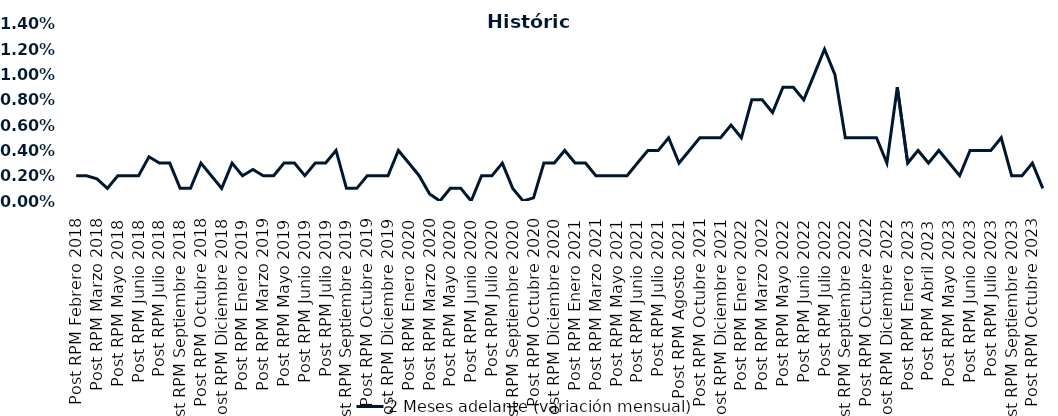
| Category | 2 Meses adelante (variación mensual) |
|---|---|
| Post RPM Febrero 2018 | 0.002 |
| Pre RPM Marzo 2018 | 0.002 |
| Post RPM Marzo 2018 | 0.002 |
| Pre RPM Mayo 2018 | 0.001 |
| Post RPM Mayo 2018 | 0.002 |
| Pre RPM Junio 2018 | 0.002 |
| Post RPM Junio 2018 | 0.002 |
| Pre RPM Julio 2018 | 0.004 |
| Post RPM Julio 2018 | 0.003 |
| Pre RPM Septiembre 2018 | 0.003 |
| Post RPM Septiembre 2018 | 0.001 |
| Pre RPM Octubre 2018 | 0.001 |
| Post RPM Octubre 2018 | 0.003 |
| Pre RPM Diciembre 2018 | 0.002 |
| Post RPM Diciembre 2018 | 0.001 |
| Pre RPM Enero 2019 | 0.003 |
| Post RPM Enero 2019 | 0.002 |
| Pre RPM Marzo 2019 | 0.002 |
| Post RPM Marzo 2019 | 0.002 |
| Pre RPM Mayo 2019 | 0.002 |
| Post RPM Mayo 2019 | 0.003 |
| Pre RPM Junio 2019 | 0.003 |
| Post RPM Junio 2019 | 0.002 |
| Pre RPM Julio 2019 | 0.003 |
| Post RPM Julio 2019 | 0.003 |
| Pre RPM Septiembre 2019 | 0.004 |
| Post RPM Septiembre 2019 | 0.001 |
| Pre RPM Octubre 2019 | 0.001 |
| Post RPM Octubre 2019 | 0.002 |
| Pre RPM Diciembre 2019 | 0.002 |
| Post RPM Diciembre 2019 | 0.002 |
| Pre RPM Enero 2020 | 0.004 |
| Post RPM Enero 2020 | 0.003 |
| Pre RPM Marzo 2020 | 0.002 |
| Post RPM Marzo 2020 | 0.001 |
| Pre RPM Mayo 2020 | 0 |
| Post RPM Mayo 2020 | 0.001 |
| Pre RPM Junio 2020 | 0.001 |
| Post RPM Junio 2020 | 0 |
| Pre RPM Julio 2020 | 0.002 |
| Post RPM Julio 2020 | 0.002 |
| Pre RPM Septiembre 2020 | 0.003 |
| Post RPM Septiembre 2020 | 0.001 |
| Pre RPM Octubre 2020 | 0 |
| Post RPM Octubre 2020 | 0 |
| Pre RPM Diciembre 2020 | 0.003 |
| Post RPM Diciembre 2020 | 0.003 |
| Pre RPM Enero 2021 | 0.004 |
| Post RPM Enero 2021 | 0.003 |
| Pre RPM Marzo 2021 | 0.003 |
| Post RPM Marzo 2021 | 0.002 |
| Pre RPM Mayo 2021 | 0.002 |
| Post RPM Mayo 2021 | 0.002 |
| Pre RPM Junio 2021 | 0.002 |
| Post RPM Junio 2021 | 0.003 |
| Pre RPM Julio 2021 | 0.004 |
| Post RPM Julio 2021 | 0.004 |
| Pre RPM Agosto 2021 | 0.005 |
| Post RPM Agosto 2021 | 0.003 |
| Pre RPM Octubre 2021 | 0.004 |
| Post RPM Octubre 2021 | 0.005 |
| Pre RPM Diciembre 2021 | 0.005 |
| Post RPM Diciembre 2021 | 0.005 |
| Pre RPM Enero 2022 | 0.006 |
| Post RPM Enero 2022 | 0.005 |
| Pre RPM Marzo 2022 | 0.008 |
| Post RPM Marzo 2022 | 0.008 |
| Pre RPM Mayo 2022 | 0.007 |
| Post RPM Mayo 2022 | 0.009 |
| Pre RPM Junio 2022 | 0.009 |
| Post RPM Junio 2022 | 0.008 |
| Pre RPM Julio 2022 | 0.01 |
| Post RPM Julio 2022 | 0.012 |
| Pre RPM Septiembre 2022 | 0.01 |
| Post RPM Septiembre 2022 | 0.005 |
| Pre RPM Octubre 2022 | 0.005 |
| Post RPM Octubre 2022 | 0.005 |
| Pre RPM Diciembre 2022 | 0.005 |
| Post RPM Diciembre 2022 | 0.003 |
| Pre RPM Enero 2023 | 0.009 |
| Post RPM Enero 2023 | 0.003 |
| Pre RPM Abril 2023 | 0.004 |
| Post RPM Abril 2023 | 0.003 |
| Pre RPM Mayo 2023 | 0.004 |
| Post RPM Mayo 2023 | 0.003 |
| Pre RPM Junio 2023 | 0.002 |
| Post RPM Junio 2023 | 0.004 |
| Pre RPM Julio 2023 | 0.004 |
| Post RPM Julio 2023 | 0.004 |
| Pre RPM Septiembre 2023 | 0.005 |
| Post RPM Septiembre 2023 | 0.002 |
| Pre RPM Octubre 2023 | 0.002 |
| Post RPM Octubre 2023 | 0.003 |
| Pre RPM Diciembre 2023 | 0.001 |